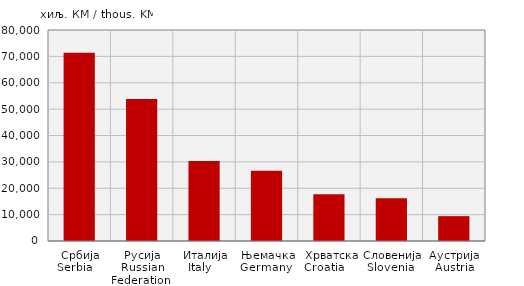
| Category | Увоз
Import |
|---|---|
| Србија
Serbia    | 71372 |
| Русија
Russian Federation  | 53819 |
| Италија
Italy    | 30317 |
| Њемачка
Germany  | 26634 |
|  Хрватска
Croatia    | 17767 |
| Словенија
Slovenia  | 16173 |
| Аустрија
Austria | 9427 |